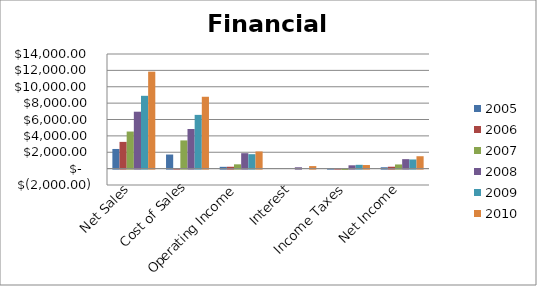
| Category | 2005 | 2006 | 2007 | 2008 | 2009 | 2010 |
|---|---|---|---|---|---|---|
| Net Sales | 2401 | 3265 | 4531 | 6952 | 8894 | 11844 |
| Cost of Sales | 1722 | 23.5 | 3446 | 4839 | 6564 | 8777 |
| Operating Income | 219 | 229 | 526 | 1886 | 1762 | 2096 |
| Interest | 0 | 0 | 0 | 164 | 0 | 311 |
| Income Taxes | 55 | 7 | -34 | 407 | 465 | 439 |
| Net Income | 167 | 232 | 510 | 1158 | 1118 | 1514 |